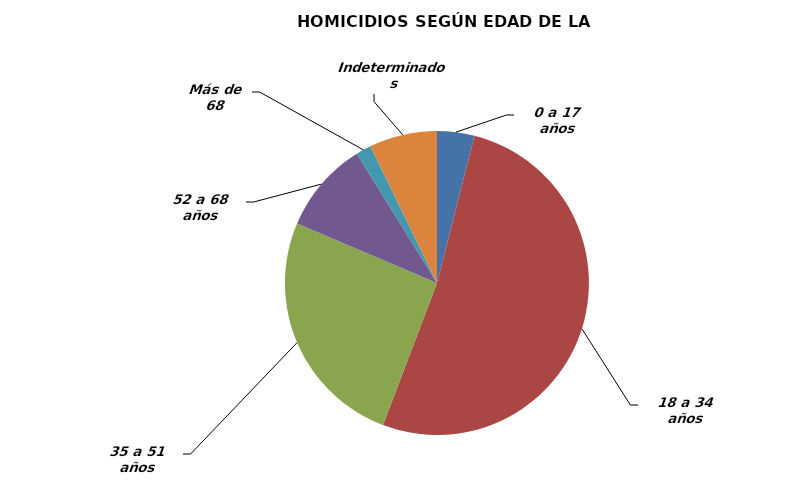
| Category | 0 a 17 años |
|---|---|
| 0 a 17 años | 22 |
| 18 a 34 años | 287 |
| 35 a 51 años | 142 |
| 52 a 68 años | 54 |
| Más de 68 | 9 |
| Indeterminados | 40 |